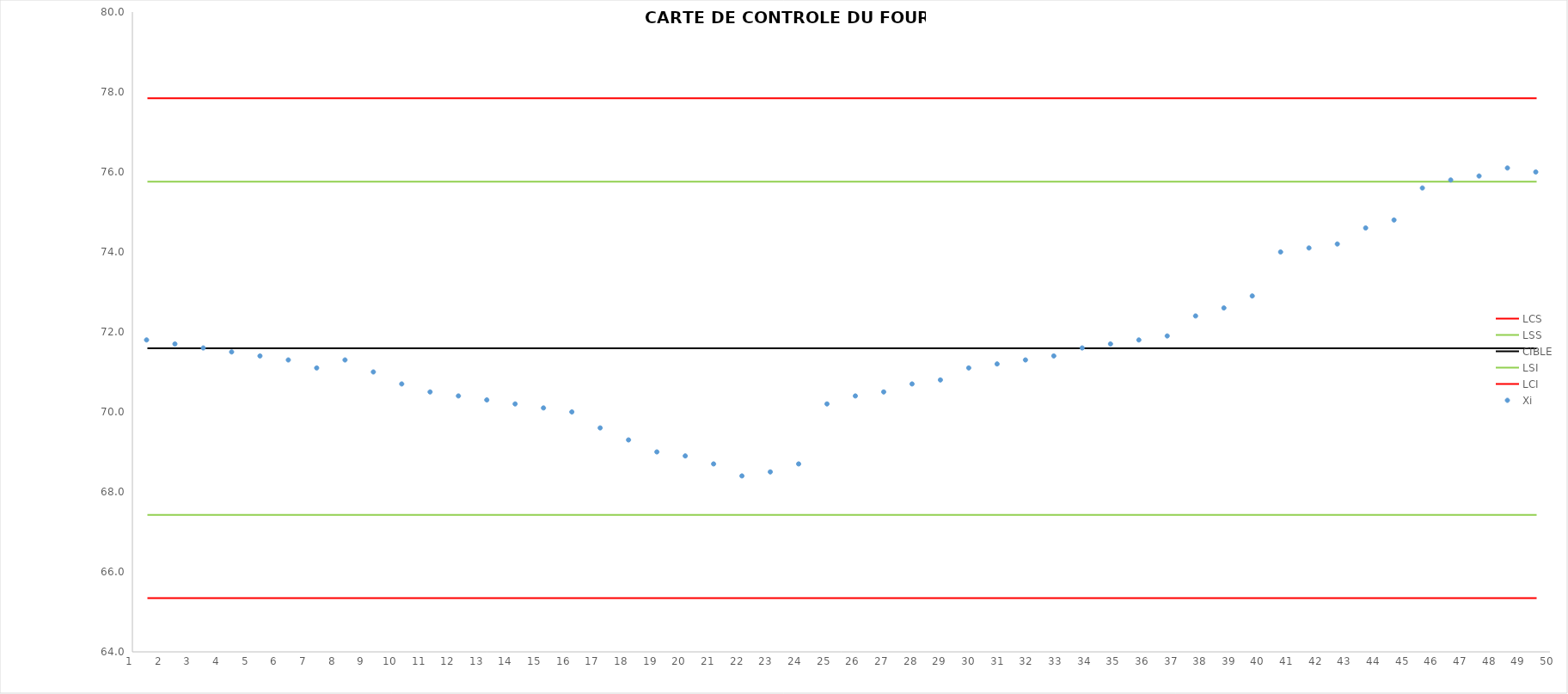
| Category | LCS | LSS | CIBLE | LSI | LCI |
|---|---|---|---|---|---|
| 1 | 77.841 | 75.758 | 71.592 | 67.426 | 65.343 |
| 2 | 77.841 | 75.758 | 71.592 | 67.426 | 65.343 |
| 3 | 77.841 | 75.758 | 71.592 | 67.426 | 65.343 |
| 4 | 77.841 | 75.758 | 71.592 | 67.426 | 65.343 |
| 5 | 77.841 | 75.758 | 71.592 | 67.426 | 65.343 |
| 6 | 77.841 | 75.758 | 71.592 | 67.426 | 65.343 |
| 7 | 77.841 | 75.758 | 71.592 | 67.426 | 65.343 |
| 8 | 77.841 | 75.758 | 71.592 | 67.426 | 65.343 |
| 9 | 77.841 | 75.758 | 71.592 | 67.426 | 65.343 |
| 10 | 77.841 | 75.758 | 71.592 | 67.426 | 65.343 |
| 11 | 77.841 | 75.758 | 71.592 | 67.426 | 65.343 |
| 12 | 77.841 | 75.758 | 71.592 | 67.426 | 65.343 |
| 13 | 77.841 | 75.758 | 71.592 | 67.426 | 65.343 |
| 14 | 77.841 | 75.758 | 71.592 | 67.426 | 65.343 |
| 15 | 77.841 | 75.758 | 71.592 | 67.426 | 65.343 |
| 16 | 77.841 | 75.758 | 71.592 | 67.426 | 65.343 |
| 17 | 77.841 | 75.758 | 71.592 | 67.426 | 65.343 |
| 18 | 77.841 | 75.758 | 71.592 | 67.426 | 65.343 |
| 19 | 77.841 | 75.758 | 71.592 | 67.426 | 65.343 |
| 20 | 77.841 | 75.758 | 71.592 | 67.426 | 65.343 |
| 21 | 77.841 | 75.758 | 71.592 | 67.426 | 65.343 |
| 22 | 77.841 | 75.758 | 71.592 | 67.426 | 65.343 |
| 23 | 77.841 | 75.758 | 71.592 | 67.426 | 65.343 |
| 24 | 77.841 | 75.758 | 71.592 | 67.426 | 65.343 |
| 25 | 77.841 | 75.758 | 71.592 | 67.426 | 65.343 |
| 26 | 77.841 | 75.758 | 71.592 | 67.426 | 65.343 |
| 27 | 77.841 | 75.758 | 71.592 | 67.426 | 65.343 |
| 28 | 77.841 | 75.758 | 71.592 | 67.426 | 65.343 |
| 29 | 77.841 | 75.758 | 71.592 | 67.426 | 65.343 |
| 30 | 77.841 | 75.758 | 71.592 | 67.426 | 65.343 |
| 31 | 77.841 | 75.758 | 71.592 | 67.426 | 65.343 |
| 32 | 77.841 | 75.758 | 71.592 | 67.426 | 65.343 |
| 33 | 77.841 | 75.758 | 71.592 | 67.426 | 65.343 |
| 34 | 77.841 | 75.758 | 71.592 | 67.426 | 65.343 |
| 35 | 77.841 | 75.758 | 71.592 | 67.426 | 65.343 |
| 36 | 77.841 | 75.758 | 71.592 | 67.426 | 65.343 |
| 37 | 77.841 | 75.758 | 71.592 | 67.426 | 65.343 |
| 38 | 77.841 | 75.758 | 71.592 | 67.426 | 65.343 |
| 39 | 77.841 | 75.758 | 71.592 | 67.426 | 65.343 |
| 40 | 77.841 | 75.758 | 71.592 | 67.426 | 65.343 |
| 41 | 77.841 | 75.758 | 71.592 | 67.426 | 65.343 |
| 42 | 77.841 | 75.758 | 71.592 | 67.426 | 65.343 |
| 43 | 77.841 | 75.758 | 71.592 | 67.426 | 65.343 |
| 44 | 77.841 | 75.758 | 71.592 | 67.426 | 65.343 |
| 45 | 77.841 | 75.758 | 71.592 | 67.426 | 65.343 |
| 46 | 77.841 | 75.758 | 71.592 | 67.426 | 65.343 |
| 47 | 77.841 | 75.758 | 71.592 | 67.426 | 65.343 |
| 48 | 77.841 | 75.758 | 71.592 | 67.426 | 65.343 |
| 49 | 77.841 | 75.758 | 71.592 | 67.426 | 65.343 |
| 50 | 77.841 | 75.758 | 71.592 | 67.426 | 65.343 |